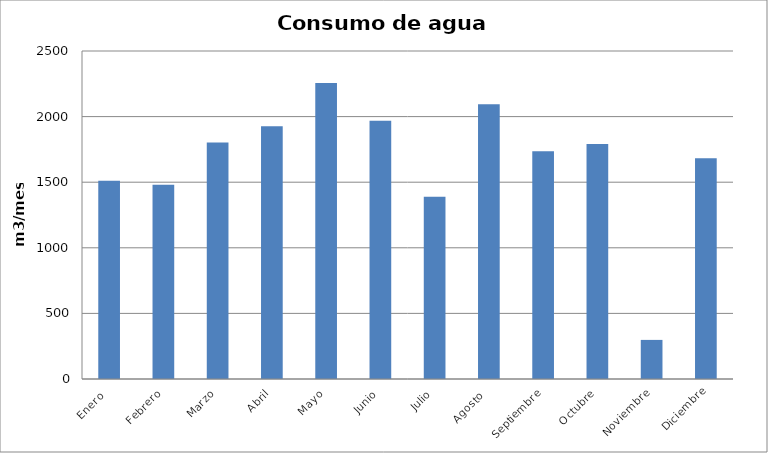
| Category | Series 0 |
|---|---|
| Enero  | 1511 |
| Febrero | 1480 |
| Marzo | 1802 |
| Abril | 1926 |
| Mayo | 2256 |
| Junio | 1969 |
| Julio | 1389 |
| Agosto  | 2095 |
| Septiembre | 1735 |
| Octubre | 1791 |
| Noviembre | 298 |
| Diciembre | 1682 |